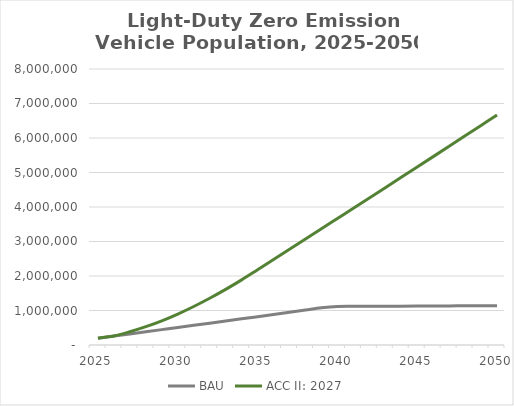
| Category | BAU | ACC II: 2027 |
|---|---|---|
| 2025.0 | 198663.11 | 198663.11 |
| 2026.0 | 260348.757 | 260348.757 |
| 2027.0 | 322073.858 | 383798.959 |
| 2028.0 | 383838.082 | 530309.443 |
| 2029.0 | 445641.099 | 699908.419 |
| 2030.0 | 507482.578 | 895500.076 |
| 2031.0 | 569663.35 | 1115301.873 |
| 2032.0 | 632183.506 | 1353750.839 |
| 2033.0 | 695043.138 | 1611036.775 |
| 2034.0 | 758242.338 | 1887349.556 |
| 2035.0 | 821781.198 | 2182879.139 |
| 2036.0 | 885407.406 | 2478814.991 |
| 2037.0 | 949120.962 | 2775157.113 |
| 2038.0 | 1012921.866 | 3071905.503 |
| 2039.0 | 1076810.118 | 3369060.163 |
| 2040.0 | 1115668.538 | 3666621.092 |
| 2041.0 | 1120391.779 | 3964158.287 |
| 2042.0 | 1122523.061 | 4262261.476 |
| 2043.0 | 1124653.888 | 4560930.538 |
| 2044.0 | 1126784.259 | 4860165.353 |
| 2045.0 | 1128914.173 | 5159965.8 |
| 2046.0 | 1131070.928 | 5460339.006 |
| 2047.0 | 1133227.24 | 5761284.854 |
| 2048.0 | 1135383.112 | 6062803.226 |
| 2049.0 | 1137538.542 | 6364894.006 |
| 2050.0 | 1139693.53 | 6667557.076 |